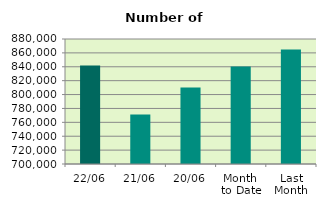
| Category | Series 0 |
|---|---|
| 22/06 | 842016 |
| 21/06 | 771282 |
| 20/06 | 810200 |
| Month 
to Date | 840337.125 |
| Last
Month | 864947.091 |